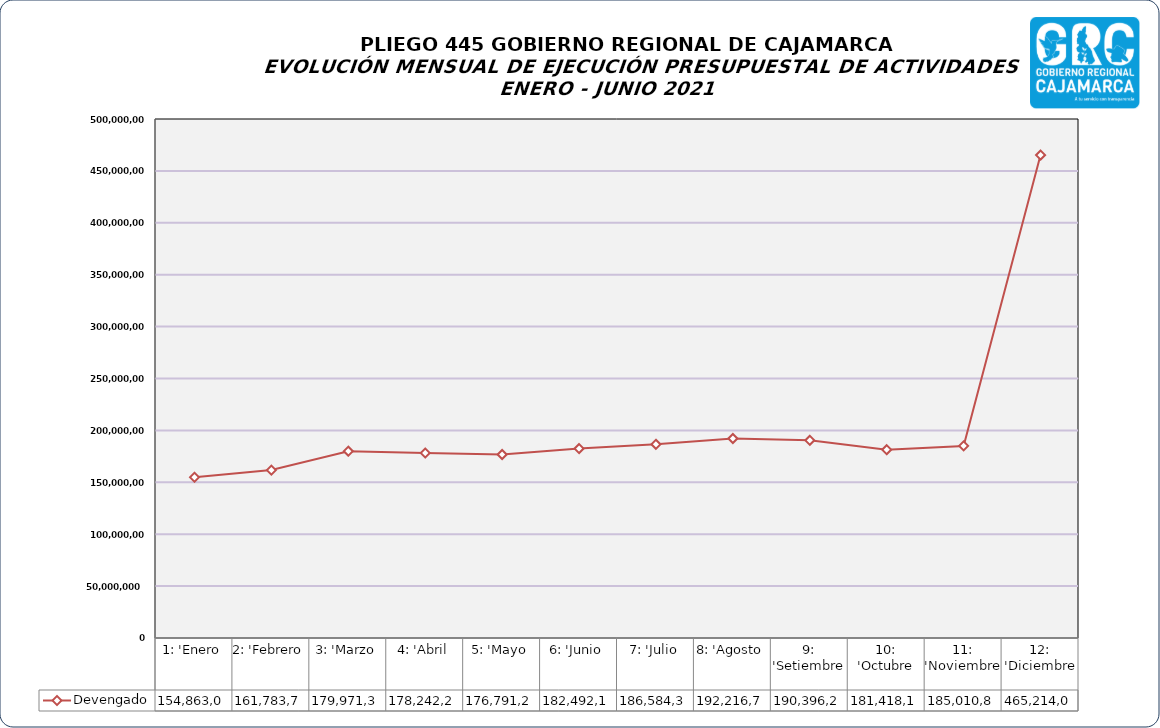
| Category | Devengado  |
|---|---|
| 1: 'Enero | 154863022 |
| 2: 'Febrero | 161783742 |
| 3: 'Marzo | 179971387 |
| 4: 'Abril | 178242212 |
| 5: 'Mayo | 176791222 |
| 6: 'Junio | 182492106 |
| 7: 'Julio | 186584344 |
| 8: 'Agosto | 192216704 |
| 9: 'Setiembre | 190396209 |
| 10: 'Octubre | 181418190 |
| 11: 'Noviembre | 185010822 |
| 12: 'Diciembre | 465214071 |